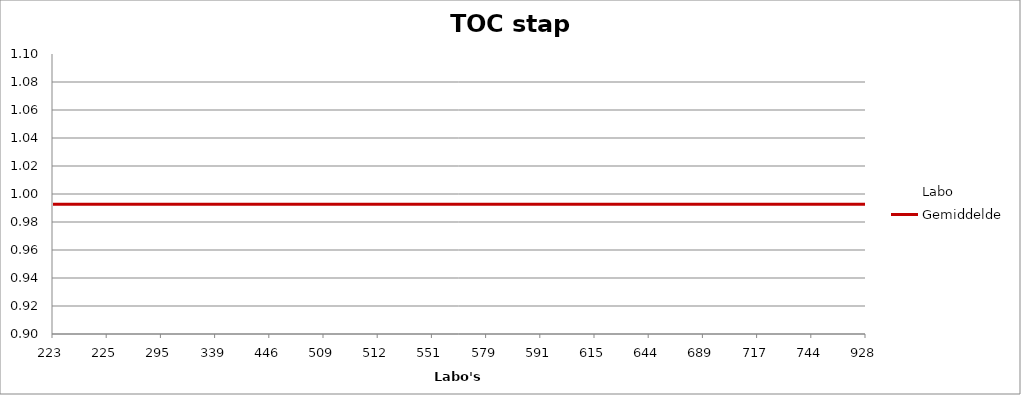
| Category | Labo | Gemiddelde |
|---|---|---|
| 223.0 | 1.002 | 0.993 |
| 225.0 | 1.02 | 0.993 |
| 295.0 | 0.982 | 0.993 |
| 339.0 | 1.01 | 0.993 |
| 446.0 | 1.038 | 0.993 |
| 509.0 | 1.018 | 0.993 |
| 512.0 | 1.006 | 0.993 |
| 551.0 | 1.024 | 0.993 |
| 579.0 | 0.99 | 0.993 |
| 591.0 | 0.974 | 0.993 |
| 615.0 | 0.897 | 0.993 |
| 644.0 | 0.992 | 0.993 |
| 689.0 | 0.974 | 0.993 |
| 717.0 | 0.945 | 0.993 |
| 744.0 | 0.99 | 0.993 |
| 928.0 | 0.968 | 0.993 |